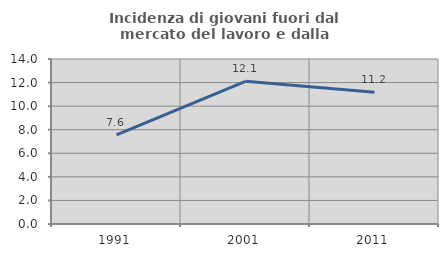
| Category | Incidenza di giovani fuori dal mercato del lavoro e dalla formazione  |
|---|---|
| 1991.0 | 7.566 |
| 2001.0 | 12.105 |
| 2011.0 | 11.181 |